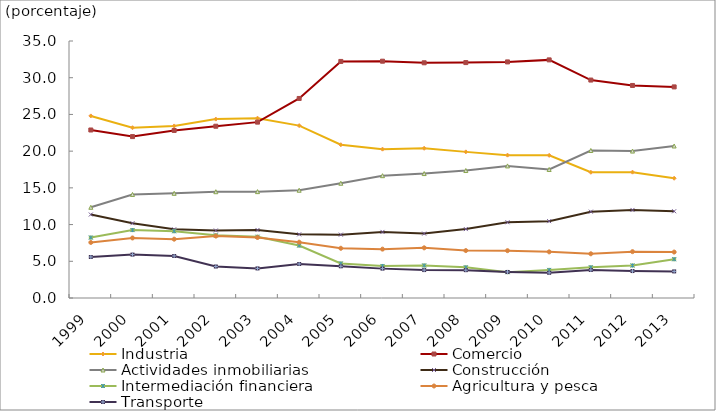
| Category | Industria | Comercio | Actividades inmobiliarias | Construcción  | Intermediación financiera | Agricultura y pesca | Transporte |
|---|---|---|---|---|---|---|---|
| 1999.0 | 24.798 | 22.881 | 12.353 | 11.369 | 8.232 | 7.565 | 5.587 |
| 2000.0 | 23.188 | 21.982 | 14.104 | 10.188 | 9.251 | 8.175 | 5.911 |
| 2001.0 | 23.431 | 22.82 | 14.256 | 9.353 | 9.096 | 8.011 | 5.722 |
| 2002.0 | 24.363 | 23.394 | 14.472 | 9.195 | 8.532 | 8.437 | 4.287 |
| 2003.0 | 24.49 | 23.951 | 14.487 | 9.263 | 8.343 | 8.237 | 4.029 |
| 2004.0 | 23.474 | 27.175 | 14.676 | 8.669 | 7.145 | 7.6 | 4.631 |
| 2005.0 | 20.874 | 32.218 | 15.628 | 8.627 | 4.704 | 6.772 | 4.319 |
| 2006.0 | 20.269 | 32.25 | 16.658 | 9 | 4.36 | 6.655 | 4.001 |
| 2007.0 | 20.392 | 32.033 | 16.946 | 8.77 | 4.431 | 6.833 | 3.805 |
| 2008.0 | 19.901 | 32.06 | 17.36 | 9.385 | 4.176 | 6.458 | 3.794 |
| 2009.0 | 19.454 | 32.152 | 17.989 | 10.312 | 3.52 | 6.446 | 3.548 |
| 2010.0 | 19.428 | 32.428 | 17.505 | 10.466 | 3.823 | 6.285 | 3.427 |
| 2011.0 | 17.124 | 29.682 | 20.088 | 11.758 | 4.181 | 6.021 | 3.814 |
| 2012.0 | 17.137 | 28.945 | 20.01 | 11.991 | 4.427 | 6.312 | 3.67 |
| 2013.0 | 16.31 | 28.75 | 20.702 | 11.812 | 5.282 | 6.256 | 3.623 |